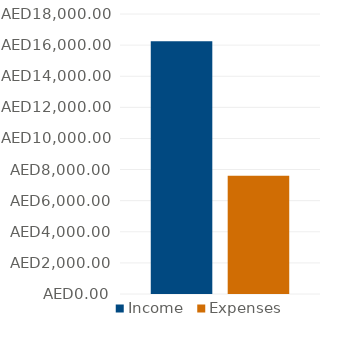
| Category | Income | Expenses |
|---|---|---|
| 0 | 16250 | 7600 |